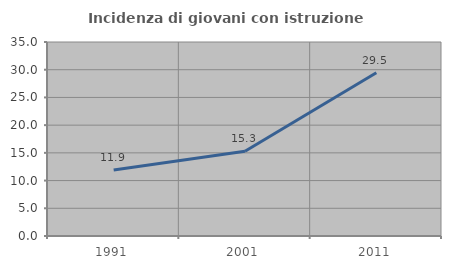
| Category | Incidenza di giovani con istruzione universitaria |
|---|---|
| 1991.0 | 11.91 |
| 2001.0 | 15.278 |
| 2011.0 | 29.464 |